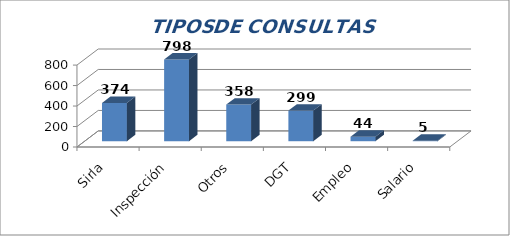
| Category | Series 0 |
|---|---|
| Sirla | 374 |
| Inspección | 798 |
| Otros | 358 |
| DGT | 299 |
| Empleo | 44 |
| Salario | 5 |